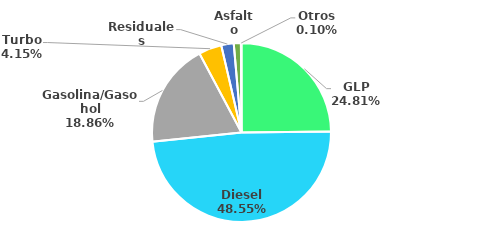
| Category | MBPD |
|---|---|
| GLP | 66.403 |
| Diesel | 129.94 |
| Gasolina/Gasohol | 50.48 |
| Turbo | 11.1 |
| Residuales | 6.023 |
| Asfalto | 3.433 |
| Otros | 0.279 |